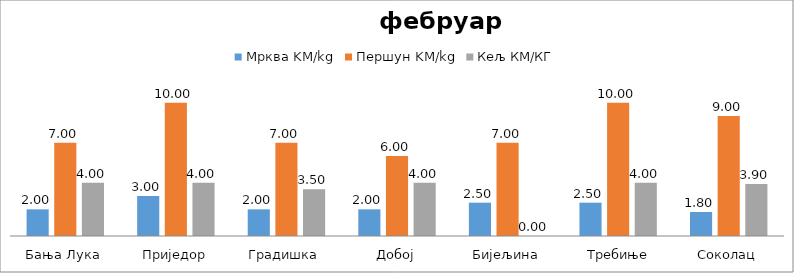
| Category | Мрква | Першун | Кељ |
|---|---|---|---|
| Бања Лука | 2 | 7 | 4 |
| Приједор | 3 | 10 | 4 |
| Градишка | 2 | 7 | 3.5 |
| Добој | 2 | 6 | 4 |
| Бијељина | 2.5 | 7 | 0 |
|  Требиње | 2.5 | 10 | 4 |
| Соколац | 1.8 | 9 | 3.9 |